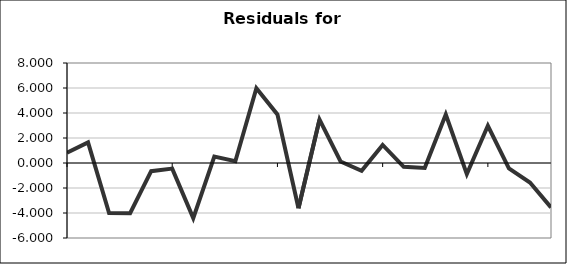
| Category | Series 0 |
|---|---|
| 0 | 0.826 |
| 1 | 1.653 |
| 2 | -4.001 |
| 3 | -4.016 |
| 4 | -0.653 |
| 5 | -0.451 |
| 6 | -4.404 |
| 7 | 0.508 |
| 8 | 0.146 |
| 9 | 5.981 |
| 10 | 3.89 |
| 11 | -3.622 |
| 12 | 3.47 |
| 13 | 0.123 |
| 14 | -0.626 |
| 15 | 1.443 |
| 16 | -0.307 |
| 17 | -0.398 |
| 18 | 3.882 |
| 19 | -0.885 |
| 20 | 2.978 |
| 21 | -0.425 |
| 22 | -1.56 |
| 23 | -3.553 |